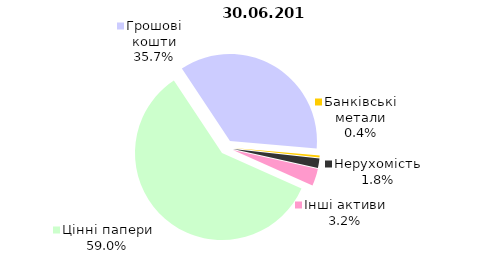
| Category | 30.06.2018 |
|---|---|
| Цінні папери | 1496.8 |
| Грошові кошти | 905.4 |
| Банківські метали | 9.1 |
| Нерухомість | 45.2 |
| Інші активи | 80.2 |